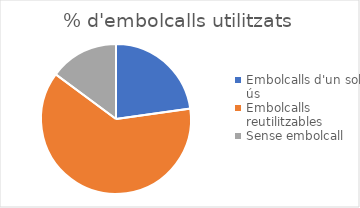
| Category | % |
|---|---|
| Embolcalls d'un sol ús
 | 23 |
| Embolcalls reutilitzables
 | 63 |
| Sense embolcall | 15 |